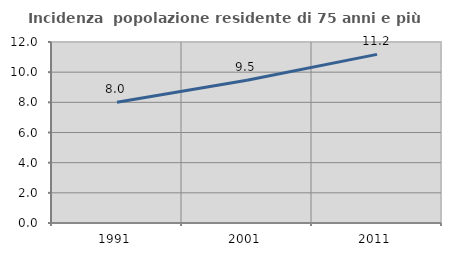
| Category | Incidenza  popolazione residente di 75 anni e più |
|---|---|
| 1991.0 | 8.011 |
| 2001.0 | 9.469 |
| 2011.0 | 11.181 |